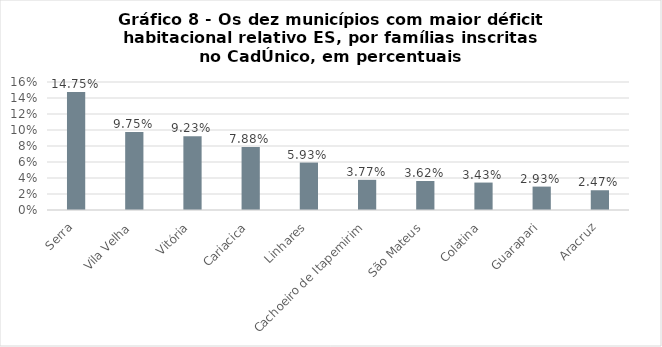
| Category | Series 0 |
|---|---|
| Serra | 0.148 |
| Vila Velha | 0.097 |
| Vitória | 0.092 |
| Cariacica | 0.079 |
| Linhares | 0.059 |
| Cachoeiro de Itapemirim | 0.038 |
| São Mateus | 0.036 |
| Colatina | 0.034 |
| Guarapari | 0.029 |
| Aracruz | 0.025 |